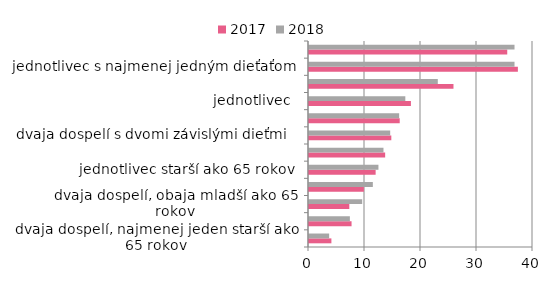
| Category | 2017 | 2018 |
|---|---|---|
| dvaja dospelí, najmenej jeden starší ako 65 rokov | 4 | 3.6 |
| domácnosti  bez závislých detí     | 7.6 | 7.3 |
| dvaja dospelí, obaja mladší ako 65 rokov | 7.2 | 9.5 |
| dvaja dospelí s jedným závislým dieťaťom  | 9.8 | 11.4 |
| jednotlivec starší ako 65 rokov | 11.9 | 12.4 |
| traja a viac dospelí so závislými deťmi    | 13.6 | 13.3 |
| dvaja dospelí s dvomi závislými dieťmi   | 14.7 | 14.5 |
| domácnosti so závislými deťmi    | 16.2 | 16.1 |
| jednotlivec  | 18.2 | 17.2 |
| jednotlivec mladší ako 65 rokov | 25.8 | 23 |
| jednotlivec s najmenej jedným dieťaťom | 37.3 | 36.7 |
| dvaja dospelí s tromi a viac závislými deťmi   | 35.4 | 36.7 |